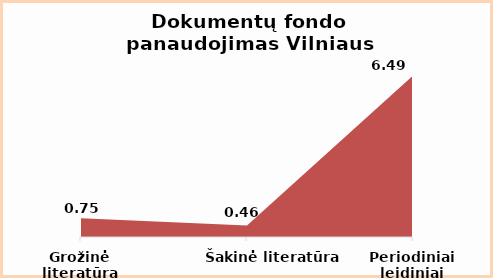
| Category | Series 0 |
|---|---|
| Grožinė literatūra | 0.75 |
| Šakinė literatūra | 0.46 |
| Periodiniai leidiniai | 6.49 |